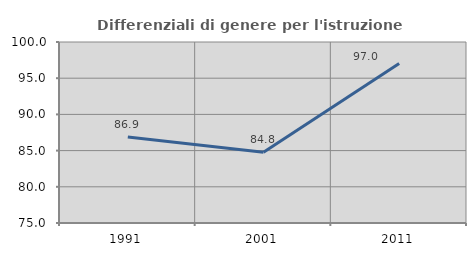
| Category | Differenziali di genere per l'istruzione superiore |
|---|---|
| 1991.0 | 86.874 |
| 2001.0 | 84.772 |
| 2011.0 | 97.019 |